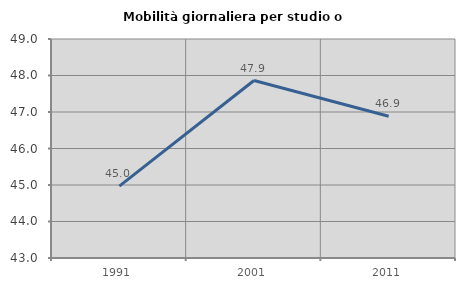
| Category | Mobilità giornaliera per studio o lavoro |
|---|---|
| 1991.0 | 44.968 |
| 2001.0 | 47.863 |
| 2011.0 | 46.882 |